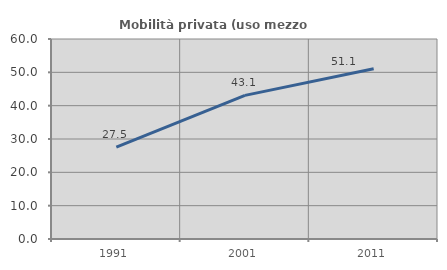
| Category | Mobilità privata (uso mezzo privato) |
|---|---|
| 1991.0 | 27.539 |
| 2001.0 | 43.094 |
| 2011.0 | 51.1 |